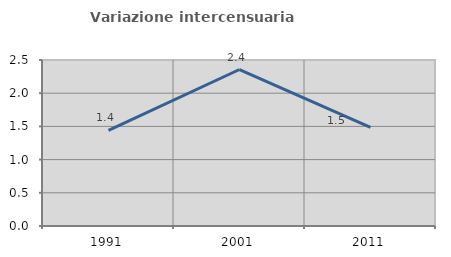
| Category | Variazione intercensuaria annua |
|---|---|
| 1991.0 | 1.441 |
| 2001.0 | 2.357 |
| 2011.0 | 1.486 |